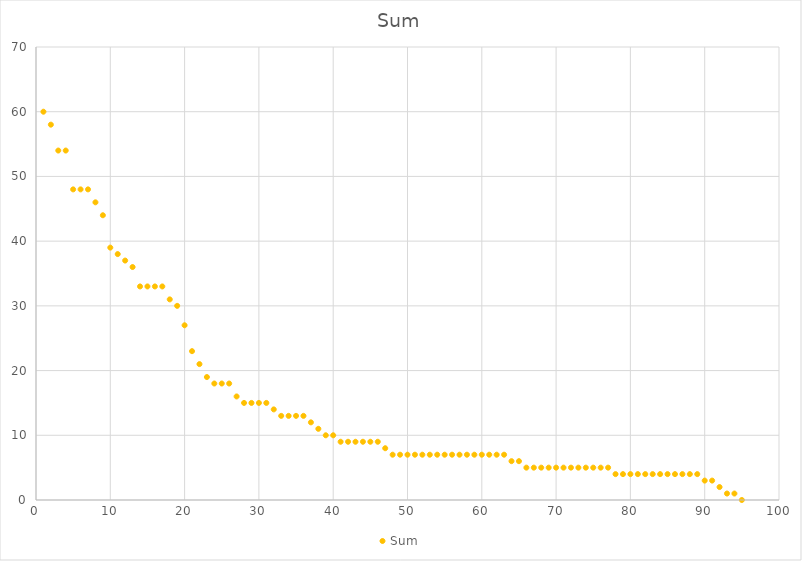
| Category | Sum |
|---|---|
| 1.0 | 60 |
| 2.0 | 58 |
| 3.0 | 54 |
| 4.0 | 54 |
| 5.0 | 48 |
| 6.0 | 48 |
| 7.0 | 48 |
| 8.0 | 46 |
| 9.0 | 44 |
| 10.0 | 39 |
| 11.0 | 38 |
| 12.0 | 37 |
| 13.0 | 36 |
| 14.0 | 33 |
| 15.0 | 33 |
| 16.0 | 33 |
| 17.0 | 33 |
| 18.0 | 31 |
| 19.0 | 30 |
| 20.0 | 27 |
| 21.0 | 23 |
| 22.0 | 21 |
| 23.0 | 19 |
| 24.0 | 18 |
| 25.0 | 18 |
| 26.0 | 18 |
| 27.0 | 16 |
| 28.0 | 15 |
| 29.0 | 15 |
| 30.0 | 15 |
| 31.0 | 15 |
| 32.0 | 14 |
| 33.0 | 13 |
| 34.0 | 13 |
| 35.0 | 13 |
| 36.0 | 13 |
| 37.0 | 12 |
| 38.0 | 11 |
| 39.0 | 10 |
| 40.0 | 10 |
| 41.0 | 9 |
| 42.0 | 9 |
| 43.0 | 9 |
| 44.0 | 9 |
| 45.0 | 9 |
| 46.0 | 9 |
| 47.0 | 8 |
| 48.0 | 7 |
| 49.0 | 7 |
| 50.0 | 7 |
| 51.0 | 7 |
| 52.0 | 7 |
| 53.0 | 7 |
| 54.0 | 7 |
| 55.0 | 7 |
| 56.0 | 7 |
| 57.0 | 7 |
| 58.0 | 7 |
| 59.0 | 7 |
| 60.0 | 7 |
| 61.0 | 7 |
| 62.0 | 7 |
| 63.0 | 7 |
| 64.0 | 6 |
| 65.0 | 6 |
| 66.0 | 5 |
| 67.0 | 5 |
| 68.0 | 5 |
| 69.0 | 5 |
| 70.0 | 5 |
| 71.0 | 5 |
| 72.0 | 5 |
| 73.0 | 5 |
| 74.0 | 5 |
| 75.0 | 5 |
| 76.0 | 5 |
| 77.0 | 5 |
| 78.0 | 4 |
| 79.0 | 4 |
| 80.0 | 4 |
| 81.0 | 4 |
| 82.0 | 4 |
| 83.0 | 4 |
| 84.0 | 4 |
| 85.0 | 4 |
| 86.0 | 4 |
| 87.0 | 4 |
| 88.0 | 4 |
| 89.0 | 4 |
| 90.0 | 3 |
| 91.0 | 3 |
| 92.0 | 2 |
| 93.0 | 1 |
| 94.0 | 1 |
| 95.0 | 0 |